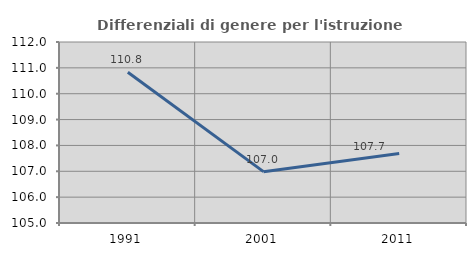
| Category | Differenziali di genere per l'istruzione superiore |
|---|---|
| 1991.0 | 110.831 |
| 2001.0 | 106.986 |
| 2011.0 | 107.684 |